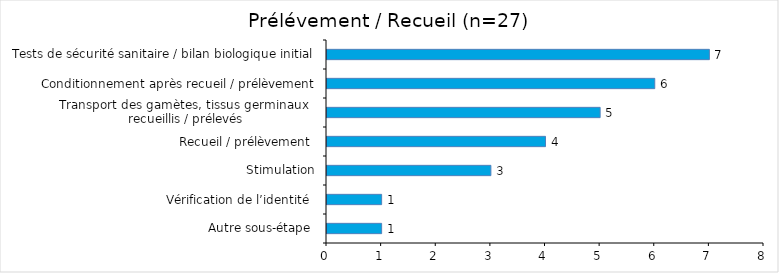
| Category | Series 0 |
|---|---|
| Autre sous-étape  | 1 |
| Vérification de l’identité  | 1 |
| Stimulation | 3 |
| Recueil / prélèvement  | 4 |
| Transport des gamètes, tissus germinaux 
recueillis / prélevés | 5 |
| Conditionnement après recueil / prélèvement | 6 |
| Tests de sécurité sanitaire / bilan biologique initial | 7 |